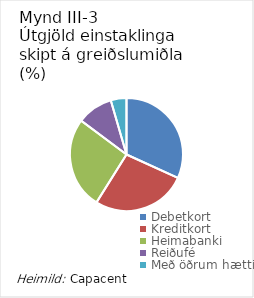
| Category | Series 0 |
|---|---|
| Debetkort | 31.8 |
| Kreditkort | 27.1 |
| Heimabanki | 26.3 |
| Reiðufé | 10.3 |
| Með öðrum hætti | 4.5 |